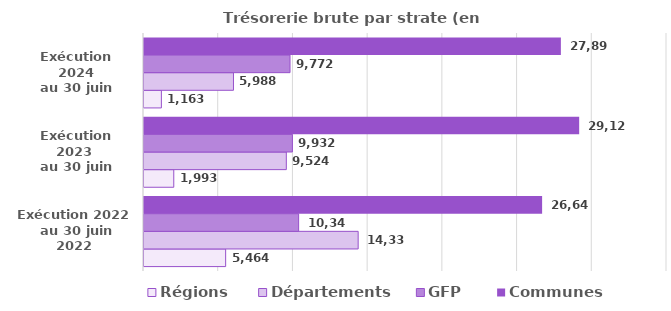
| Category | Régions | Départements | GFP | Communes  |
|---|---|---|---|---|
| Exécution 2022
 au 30 juin 2022 | 5464.3 | 14332.6 | 10348.3 | 26642.5 |
| Exécution 2023 
au 30 juin 2023 | 1992.8 | 9524.1 | 9931.9 | 29122.9 |
| Exécution 2024
au 30 juin 2024 | 1163.4 | 5987.6 | 9771.9 | 27898.4 |